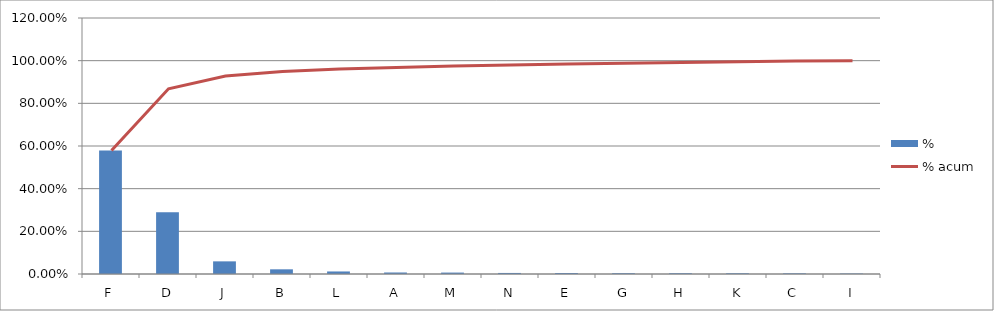
| Category | % |
|---|---|
| F | 0.579 |
| D | 0.289 |
| J | 0.059 |
| B | 0.022 |
| L | 0.012 |
| A | 0.007 |
| M | 0.007 |
| N | 0.005 |
| E | 0.004 |
| G | 0.004 |
| H | 0.004 |
| K | 0.003 |
| C | 0.003 |
| I | 0.002 |